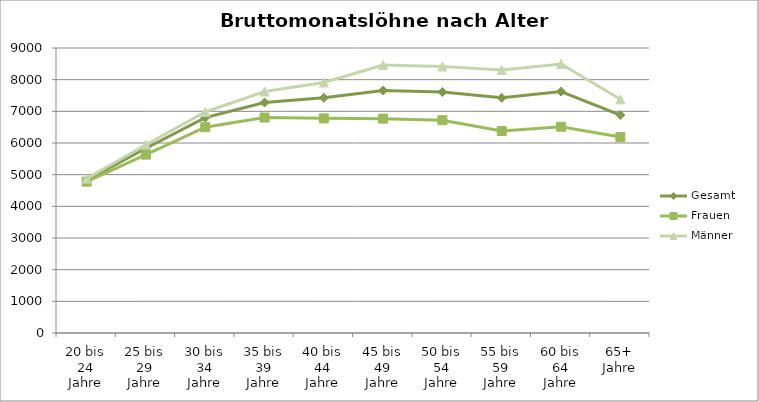
| Category | Gesamt | Frauen   | Männer   |
|---|---|---|---|
| 20 bis 24 Jahre | 4824 | 4779 | 4874 |
| 25 bis 29 Jahre | 5834 | 5633 | 5947 |
| 30 bis 34 Jahre | 6801 | 6500 | 6979 |
| 35 bis 39 Jahre | 7279 | 6803 | 7625 |
| 40 bis 44 Jahre | 7426 | 6778 | 7910 |
| 45 bis 49 Jahre | 7658 | 6769 | 8460 |
| 50 bis 54 Jahre | 7609 | 6721 | 8416 |
| 55 bis 59 Jahre | 7427 | 6377 | 8306 |
| 60 bis 64 Jahre | 7623 | 6513 | 8497 |
| 65+ Jahre | 6883 | 6188 | 7380 |